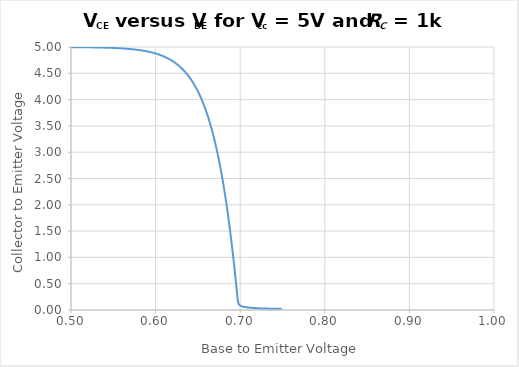
| Category | V(ce) |
|---|---|
| 0.45 | 5 |
| 0.451 | 5 |
| 0.452 | 5 |
| 0.453 | 5 |
| 0.454 | 5 |
| 0.455 | 5 |
| 0.456 | 5 |
| 0.457 | 5 |
| 0.458 | 4.999 |
| 0.459 | 4.999 |
| 0.46 | 4.999 |
| 0.461 | 4.999 |
| 0.462 | 4.999 |
| 0.463 | 4.999 |
| 0.464 | 4.999 |
| 0.465 | 4.999 |
| 0.466 | 4.999 |
| 0.467 | 4.999 |
| 0.468 | 4.999 |
| 0.469 | 4.999 |
| 0.47 | 4.999 |
| 0.471 | 4.999 |
| 0.472 | 4.999 |
| 0.473 | 4.999 |
| 0.474 | 4.999 |
| 0.475 | 4.999 |
| 0.476 | 4.999 |
| 0.477 | 4.999 |
| 0.478 | 4.999 |
| 0.479 | 4.999 |
| 0.48 | 4.999 |
| 0.481 | 4.999 |
| 0.482 | 4.999 |
| 0.483 | 4.999 |
| 0.484 | 4.999 |
| 0.485 | 4.999 |
| 0.486 | 4.998 |
| 0.487 | 4.998 |
| 0.488 | 4.998 |
| 0.489 | 4.998 |
| 0.49 | 4.998 |
| 0.491 | 4.998 |
| 0.492 | 4.998 |
| 0.493 | 4.998 |
| 0.494 | 4.998 |
| 0.495 | 4.998 |
| 0.496 | 4.998 |
| 0.497 | 4.998 |
| 0.498 | 4.998 |
| 0.499 | 4.998 |
| 0.5 | 4.997 |
| 0.501 | 4.997 |
| 0.502 | 4.997 |
| 0.503 | 4.997 |
| 0.504 | 4.997 |
| 0.505 | 4.997 |
| 0.506 | 4.997 |
| 0.507 | 4.997 |
| 0.508 | 4.996 |
| 0.509 | 4.996 |
| 0.51 | 4.996 |
| 0.511 | 4.996 |
| 0.512 | 4.996 |
| 0.513 | 4.996 |
| 0.514 | 4.996 |
| 0.515 | 4.995 |
| 0.516 | 4.995 |
| 0.517 | 4.995 |
| 0.518 | 4.995 |
| 0.519 | 4.995 |
| 0.52 | 4.994 |
| 0.521 | 4.994 |
| 0.522 | 4.994 |
| 0.523 | 4.994 |
| 0.524 | 4.993 |
| 0.525 | 4.993 |
| 0.526 | 4.993 |
| 0.527 | 4.993 |
| 0.528 | 4.992 |
| 0.529 | 4.992 |
| 0.53 | 4.992 |
| 0.531 | 4.991 |
| 0.532 | 4.991 |
| 0.533 | 4.991 |
| 0.534 | 4.99 |
| 0.535 | 4.99 |
| 0.536 | 4.99 |
| 0.537 | 4.989 |
| 0.538 | 4.989 |
| 0.539 | 4.988 |
| 0.54 | 4.988 |
| 0.541 | 4.987 |
| 0.542 | 4.987 |
| 0.543 | 4.986 |
| 0.544 | 4.986 |
| 0.545 | 4.985 |
| 0.546 | 4.985 |
| 0.547 | 4.984 |
| 0.548 | 4.983 |
| 0.549 | 4.983 |
| 0.55 | 4.982 |
| 0.551 | 4.981 |
| 0.552 | 4.981 |
| 0.553 | 4.98 |
| 0.554 | 4.979 |
| 0.555 | 4.978 |
| 0.556 | 4.977 |
| 0.557 | 4.976 |
| 0.558 | 4.976 |
| 0.559 | 4.975 |
| 0.56 | 4.974 |
| 0.561 | 4.973 |
| 0.562 | 4.971 |
| 0.563 | 4.97 |
| 0.564 | 4.969 |
| 0.565 | 4.968 |
| 0.566 | 4.967 |
| 0.567 | 4.965 |
| 0.568 | 4.964 |
| 0.569 | 4.963 |
| 0.57 | 4.961 |
| 0.571 | 4.96 |
| 0.572 | 4.958 |
| 0.573 | 4.956 |
| 0.574 | 4.955 |
| 0.575 | 4.953 |
| 0.576 | 4.951 |
| 0.577 | 4.949 |
| 0.578 | 4.947 |
| 0.579 | 4.945 |
| 0.58 | 4.943 |
| 0.581 | 4.941 |
| 0.582 | 4.938 |
| 0.583 | 4.936 |
| 0.584 | 4.933 |
| 0.585 | 4.931 |
| 0.586 | 4.928 |
| 0.587 | 4.925 |
| 0.588 | 4.922 |
| 0.589 | 4.919 |
| 0.59 | 4.916 |
| 0.591 | 4.913 |
| 0.592 | 4.909 |
| 0.593 | 4.906 |
| 0.594 | 4.902 |
| 0.595 | 4.898 |
| 0.596 | 4.894 |
| 0.597 | 4.89 |
| 0.598 | 4.886 |
| 0.599 | 4.881 |
| 0.6 | 4.876 |
| 0.601 | 4.871 |
| 0.602 | 4.866 |
| 0.603 | 4.861 |
| 0.604 | 4.856 |
| 0.605 | 4.85 |
| 0.606 | 4.844 |
| 0.607 | 4.838 |
| 0.608 | 4.832 |
| 0.609 | 4.825 |
| 0.61 | 4.818 |
| 0.611 | 4.811 |
| 0.612 | 4.804 |
| 0.613 | 4.796 |
| 0.614 | 4.788 |
| 0.615 | 4.78 |
| 0.616 | 4.771 |
| 0.617 | 4.762 |
| 0.618 | 4.753 |
| 0.619 | 4.743 |
| 0.62 | 4.733 |
| 0.621 | 4.722 |
| 0.622 | 4.711 |
| 0.623 | 4.7 |
| 0.624 | 4.688 |
| 0.625 | 4.676 |
| 0.626 | 4.664 |
| 0.627 | 4.65 |
| 0.628 | 4.637 |
| 0.629 | 4.622 |
| 0.63 | 4.608 |
| 0.631 | 4.592 |
| 0.632 | 4.576 |
| 0.633 | 4.56 |
| 0.634 | 4.543 |
| 0.635 | 4.525 |
| 0.636 | 4.506 |
| 0.637 | 4.487 |
| 0.638 | 4.467 |
| 0.639 | 4.446 |
| 0.64 | 4.424 |
| 0.641 | 4.402 |
| 0.642 | 4.379 |
| 0.643 | 4.355 |
| 0.644 | 4.329 |
| 0.645 | 4.303 |
| 0.646 | 4.276 |
| 0.647 | 4.248 |
| 0.648 | 4.219 |
| 0.649 | 4.189 |
| 0.65 | 4.157 |
| 0.651 | 4.124 |
| 0.652 | 4.09 |
| 0.653 | 4.055 |
| 0.654 | 4.019 |
| 0.655 | 3.981 |
| 0.656 | 3.941 |
| 0.657 | 3.9 |
| 0.658 | 3.858 |
| 0.659 | 3.814 |
| 0.66 | 3.768 |
| 0.661 | 3.721 |
| 0.662 | 3.672 |
| 0.663 | 3.621 |
| 0.664 | 3.568 |
| 0.665 | 3.513 |
| 0.666 | 3.456 |
| 0.667 | 3.397 |
| 0.668 | 3.335 |
| 0.669 | 3.272 |
| 0.67 | 3.206 |
| 0.671 | 3.138 |
| 0.672 | 3.067 |
| 0.673 | 2.993 |
| 0.674 | 2.917 |
| 0.675 | 2.838 |
| 0.676 | 2.757 |
| 0.677 | 2.672 |
| 0.678 | 2.584 |
| 0.679 | 2.493 |
| 0.68 | 2.399 |
| 0.681 | 2.301 |
| 0.682 | 2.2 |
| 0.683 | 2.096 |
| 0.684 | 1.988 |
| 0.685 | 1.875 |
| 0.686 | 1.759 |
| 0.687 | 1.639 |
| 0.688 | 1.515 |
| 0.689 | 1.387 |
| 0.69 | 1.254 |
| 0.691 | 1.116 |
| 0.692 | 0.974 |
| 0.693 | 0.827 |
| 0.694 | 0.676 |
| 0.695 | 0.519 |
| 0.696 | 0.357 |
| 0.697 | 0.195 |
| 0.698 | 0.12 |
| 0.699 | 0.097 |
| 0.7 | 0.085 |
| 0.701 | 0.076 |
| 0.702 | 0.07 |
| 0.703 | 0.065 |
| 0.704 | 0.061 |
| 0.705 | 0.058 |
| 0.706 | 0.055 |
| 0.707 | 0.052 |
| 0.708 | 0.05 |
| 0.709 | 0.048 |
| 0.71 | 0.046 |
| 0.711 | 0.045 |
| 0.712 | 0.043 |
| 0.713 | 0.042 |
| 0.714 | 0.04 |
| 0.715 | 0.039 |
| 0.716 | 0.038 |
| 0.717 | 0.037 |
| 0.718 | 0.036 |
| 0.719 | 0.035 |
| 0.72 | 0.034 |
| 0.721 | 0.034 |
| 0.722 | 0.033 |
| 0.723 | 0.032 |
| 0.724 | 0.031 |
| 0.725 | 0.031 |
| 0.726 | 0.03 |
| 0.727 | 0.03 |
| 0.728 | 0.029 |
| 0.729 | 0.029 |
| 0.73 | 0.028 |
| 0.731 | 0.028 |
| 0.732 | 0.027 |
| 0.733 | 0.027 |
| 0.734 | 0.026 |
| 0.735 | 0.026 |
| 0.736 | 0.025 |
| 0.737 | 0.025 |
| 0.738 | 0.025 |
| 0.739 | 0.024 |
| 0.74 | 0.024 |
| 0.741 | 0.024 |
| 0.742 | 0.023 |
| 0.743 | 0.023 |
| 0.744 | 0.023 |
| 0.745 | 0.022 |
| 0.746 | 0.022 |
| 0.747 | 0.022 |
| 0.748 | 0.022 |
| 0.749 | 0.021 |
| 0.75 | 0.021 |